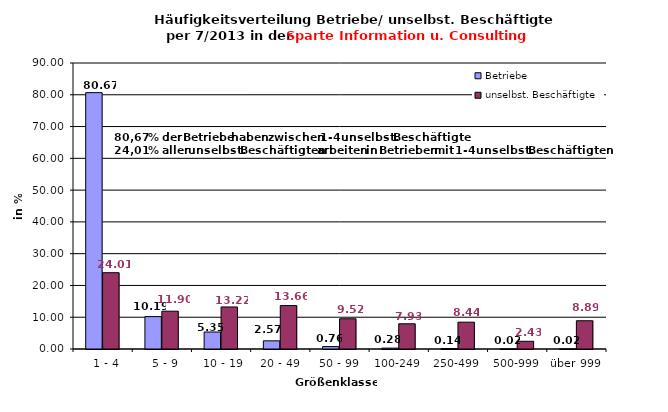
| Category | Betriebe | unselbst. Beschäftigte |
|---|---|---|
|   1 - 4 | 80.67 | 24.014 |
|   5 - 9 | 10.193 | 11.896 |
|  10 - 19 | 5.349 | 13.222 |
| 20 - 49 | 2.571 | 13.662 |
| 50 - 99 | 0.758 | 9.515 |
| 100-249 | 0.275 | 7.933 |
| 250-499 | 0.138 | 8.44 |
| 500-999 | 0.023 | 2.427 |
| über 999 | 0.023 | 8.892 |